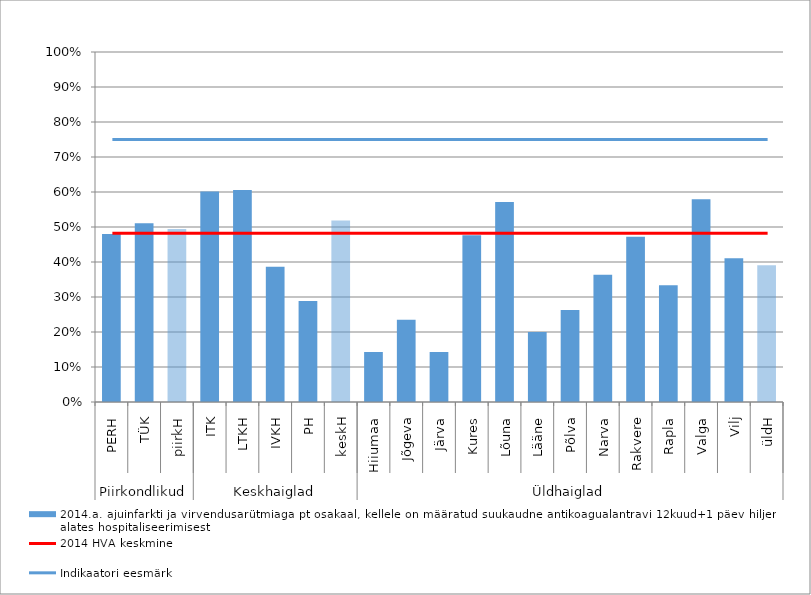
| Category | 2014.a. ajuinfarkti ja virvendusarütmiaga pt osakaal, kellele on määratud suukaudne antikoagualantravi 12kuud+1 päev hiljem alates hospitaliseerimisest |
|---|---|
| 0 | 0.48 |
| 1 | 0.511 |
| 2 | 0.494 |
| 3 | 0.602 |
| 4 | 0.606 |
| 5 | 0.387 |
| 6 | 0.288 |
| 7 | 0.518 |
| 8 | 0.143 |
| 9 | 0.235 |
| 10 | 0.143 |
| 11 | 0.476 |
| 12 | 0.571 |
| 13 | 0.2 |
| 14 | 0.263 |
| 15 | 0.364 |
| 16 | 0.472 |
| 17 | 0.333 |
| 18 | 0.579 |
| 19 | 0.411 |
| 20 | 0.391 |